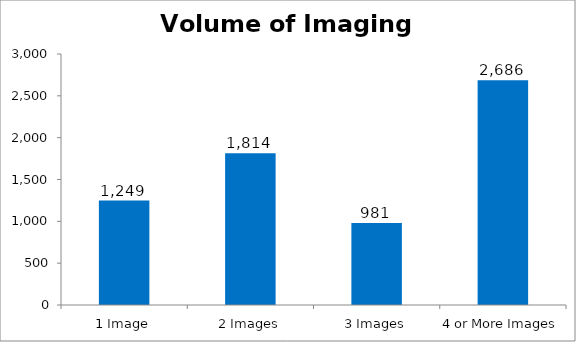
| Category | Total |
|---|---|
| 1 Image | 1249 |
| 2 Images | 1814 |
| 3 Images | 981 |
| 4 or More Images | 2686 |